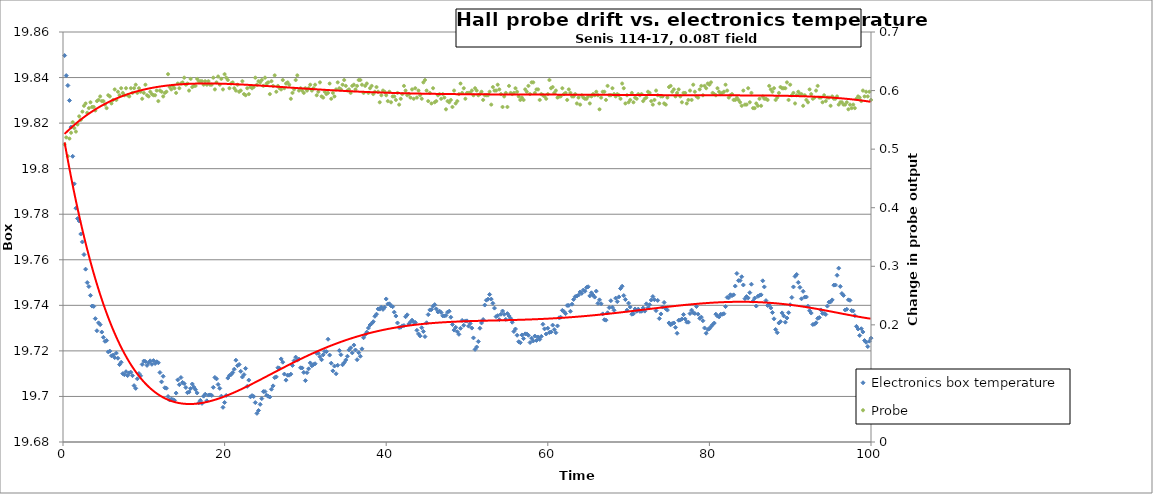
| Category | Electronics box temperature |
|---|---|
| 0.2 | 19.85 |
| 0.4 | 19.841 |
| 0.6000000000000001 | 19.837 |
| 0.8 | 19.83 |
| 1.0 | 19.818 |
| 1.2 | 19.805 |
| 1.4 | 19.793 |
| 1.5999999999999999 | 19.783 |
| 1.7999999999999998 | 19.778 |
| 1.9999999999999998 | 19.777 |
| 2.1999999999999997 | 19.771 |
| 2.4 | 19.768 |
| 2.6 | 19.762 |
| 2.8000000000000003 | 19.756 |
| 3.0000000000000004 | 19.75 |
| 3.2000000000000006 | 19.748 |
| 3.400000000000001 | 19.744 |
| 3.600000000000001 | 19.74 |
| 3.800000000000001 | 19.74 |
| 4.000000000000001 | 19.734 |
| 4.200000000000001 | 19.729 |
| 4.400000000000001 | 19.732 |
| 4.600000000000001 | 19.732 |
| 4.800000000000002 | 19.728 |
| 5.000000000000002 | 19.726 |
| 5.200000000000002 | 19.724 |
| 5.400000000000002 | 19.725 |
| 5.600000000000002 | 19.72 |
| 5.8000000000000025 | 19.72 |
| 6.000000000000003 | 19.718 |
| 6.200000000000003 | 19.718 |
| 6.400000000000003 | 19.717 |
| 6.600000000000003 | 19.719 |
| 6.800000000000003 | 19.717 |
| 7.0000000000000036 | 19.714 |
| 7.200000000000004 | 19.715 |
| 7.400000000000004 | 19.71 |
| 7.600000000000004 | 19.71 |
| 7.800000000000004 | 19.711 |
| 8.000000000000004 | 19.709 |
| 8.200000000000003 | 19.71 |
| 8.400000000000002 | 19.711 |
| 8.600000000000001 | 19.709 |
| 8.8 | 19.705 |
| 9.0 | 19.704 |
| 9.2 | 19.708 |
| 9.399999999999999 | 19.71 |
| 9.599999999999998 | 19.709 |
| 9.799999999999997 | 19.714 |
| 9.999999999999996 | 19.716 |
| 10.199999999999996 | 19.715 |
| 10.399999999999995 | 19.714 |
| 10.599999999999994 | 19.715 |
| 10.799999999999994 | 19.716 |
| 10.999999999999993 | 19.714 |
| 11.199999999999992 | 19.716 |
| 11.399999999999991 | 19.714 |
| 11.59999999999999 | 19.715 |
| 11.79999999999999 | 19.715 |
| 11.99999999999999 | 19.71 |
| 12.199999999999989 | 19.706 |
| 12.399999999999988 | 19.709 |
| 12.599999999999987 | 19.704 |
| 12.799999999999986 | 19.704 |
| 12.999999999999986 | 19.7 |
| 13.199999999999985 | 19.698 |
| 13.399999999999984 | 19.699 |
| 13.599999999999984 | 19.699 |
| 13.799999999999983 | 19.698 |
| 13.999999999999982 | 19.701 |
| 14.199999999999982 | 19.707 |
| 14.39999999999998 | 19.705 |
| 14.59999999999998 | 19.708 |
| 14.79999999999998 | 19.706 |
| 14.999999999999979 | 19.706 |
| 15.199999999999978 | 19.704 |
| 15.399999999999977 | 19.702 |
| 15.599999999999977 | 19.702 |
| 15.799999999999976 | 19.703 |
| 15.999999999999975 | 19.705 |
| 16.199999999999974 | 19.704 |
| 16.399999999999974 | 19.703 |
| 16.599999999999973 | 19.702 |
| 16.799999999999972 | 19.697 |
| 16.99999999999997 | 19.698 |
| 17.19999999999997 | 19.697 |
| 17.39999999999997 | 19.7 |
| 17.59999999999997 | 19.701 |
| 17.79999999999997 | 19.698 |
| 17.999999999999968 | 19.701 |
| 18.199999999999967 | 19.701 |
| 18.399999999999967 | 19.7 |
| 18.599999999999966 | 19.704 |
| 18.799999999999965 | 19.708 |
| 18.999999999999964 | 19.708 |
| 19.199999999999964 | 19.705 |
| 19.399999999999963 | 19.704 |
| 19.599999999999962 | 19.7 |
| 19.79999999999996 | 19.695 |
| 19.99999999999996 | 19.697 |
| 20.19999999999996 | 19.7 |
| 20.39999999999996 | 19.708 |
| 20.59999999999996 | 19.709 |
| 20.799999999999958 | 19.71 |
| 20.999999999999957 | 19.71 |
| 21.199999999999957 | 19.712 |
| 21.399999999999956 | 19.716 |
| 21.599999999999955 | 19.714 |
| 21.799999999999955 | 19.714 |
| 21.999999999999954 | 19.711 |
| 22.199999999999953 | 19.709 |
| 22.399999999999952 | 19.71 |
| 22.59999999999995 | 19.712 |
| 22.79999999999995 | 19.704 |
| 22.99999999999995 | 19.707 |
| 23.19999999999995 | 19.7 |
| 23.39999999999995 | 19.7 |
| 23.599999999999948 | 19.7 |
| 23.799999999999947 | 19.697 |
| 23.999999999999947 | 19.693 |
| 24.199999999999946 | 19.694 |
| 24.399999999999945 | 19.697 |
| 24.599999999999945 | 19.699 |
| 24.799999999999944 | 19.702 |
| 24.999999999999943 | 19.702 |
| 25.199999999999942 | 19.701 |
| 25.39999999999994 | 19.7 |
| 25.59999999999994 | 19.7 |
| 25.79999999999994 | 19.703 |
| 25.99999999999994 | 19.705 |
| 26.19999999999994 | 19.708 |
| 26.399999999999938 | 19.709 |
| 26.599999999999937 | 19.713 |
| 26.799999999999937 | 19.712 |
| 26.999999999999936 | 19.716 |
| 27.199999999999935 | 19.715 |
| 27.399999999999935 | 19.71 |
| 27.599999999999934 | 19.707 |
| 27.799999999999933 | 19.709 |
| 27.999999999999932 | 19.709 |
| 28.199999999999932 | 19.71 |
| 28.39999999999993 | 19.714 |
| 28.59999999999993 | 19.716 |
| 28.79999999999993 | 19.717 |
| 28.99999999999993 | 19.716 |
| 29.19999999999993 | 19.716 |
| 29.399999999999928 | 19.713 |
| 29.599999999999927 | 19.713 |
| 29.799999999999926 | 19.711 |
| 29.999999999999925 | 19.707 |
| 30.199999999999925 | 19.71 |
| 30.399999999999924 | 19.712 |
| 30.599999999999923 | 19.715 |
| 30.799999999999923 | 19.713 |
| 30.999999999999922 | 19.714 |
| 31.19999999999992 | 19.714 |
| 31.39999999999992 | 19.719 |
| 31.59999999999992 | 19.719 |
| 31.79999999999992 | 19.717 |
| 31.99999999999992 | 19.716 |
| 32.19999999999992 | 19.718 |
| 32.39999999999992 | 19.72 |
| 32.59999999999992 | 19.72 |
| 32.799999999999926 | 19.725 |
| 32.99999999999993 | 19.718 |
| 33.19999999999993 | 19.715 |
| 33.399999999999935 | 19.711 |
| 33.59999999999994 | 19.713 |
| 33.79999999999994 | 19.71 |
| 33.99999999999994 | 19.714 |
| 34.199999999999946 | 19.72 |
| 34.39999999999995 | 19.718 |
| 34.59999999999995 | 19.714 |
| 34.799999999999955 | 19.715 |
| 34.99999999999996 | 19.716 |
| 35.19999999999996 | 19.718 |
| 35.39999999999996 | 19.72 |
| 35.599999999999966 | 19.721 |
| 35.79999999999997 | 19.719 |
| 35.99999999999997 | 19.723 |
| 36.199999999999974 | 19.72 |
| 36.39999999999998 | 19.716 |
| 36.59999999999998 | 19.719 |
| 36.79999999999998 | 19.718 |
| 36.999999999999986 | 19.721 |
| 37.19999999999999 | 19.726 |
| 37.39999999999999 | 19.727 |
| 37.599999999999994 | 19.728 |
| 37.8 | 19.73 |
| 38.0 | 19.731 |
| 38.2 | 19.732 |
| 38.400000000000006 | 19.733 |
| 38.60000000000001 | 19.735 |
| 38.80000000000001 | 19.736 |
| 39.000000000000014 | 19.738 |
| 39.20000000000002 | 19.738 |
| 39.40000000000002 | 19.739 |
| 39.60000000000002 | 19.738 |
| 39.800000000000026 | 19.739 |
| 40.00000000000003 | 19.743 |
| 40.20000000000003 | 19.741 |
| 40.400000000000034 | 19.741 |
| 40.60000000000004 | 19.74 |
| 40.80000000000004 | 19.739 |
| 41.00000000000004 | 19.737 |
| 41.200000000000045 | 19.735 |
| 41.40000000000005 | 19.732 |
| 41.60000000000005 | 19.73 |
| 41.800000000000054 | 19.73 |
| 42.00000000000006 | 19.731 |
| 42.20000000000006 | 19.731 |
| 42.40000000000006 | 19.735 |
| 42.600000000000065 | 19.736 |
| 42.80000000000007 | 19.732 |
| 43.00000000000007 | 19.733 |
| 43.200000000000074 | 19.733 |
| 43.40000000000008 | 19.733 |
| 43.60000000000008 | 19.732 |
| 43.80000000000008 | 19.729 |
| 44.000000000000085 | 19.727 |
| 44.20000000000009 | 19.727 |
| 44.40000000000009 | 19.73 |
| 44.600000000000094 | 19.729 |
| 44.8000000000001 | 19.726 |
| 45.0000000000001 | 19.732 |
| 45.2000000000001 | 19.736 |
| 45.400000000000105 | 19.738 |
| 45.60000000000011 | 19.738 |
| 45.80000000000011 | 19.74 |
| 46.000000000000114 | 19.74 |
| 46.20000000000012 | 19.738 |
| 46.40000000000012 | 19.737 |
| 46.60000000000012 | 19.737 |
| 46.800000000000125 | 19.737 |
| 47.00000000000013 | 19.735 |
| 47.20000000000013 | 19.735 |
| 47.400000000000134 | 19.736 |
| 47.600000000000136 | 19.737 |
| 47.80000000000014 | 19.737 |
| 48.00000000000014 | 19.735 |
| 48.200000000000145 | 19.732 |
| 48.40000000000015 | 19.729 |
| 48.60000000000015 | 19.73 |
| 48.80000000000015 | 19.728 |
| 49.000000000000156 | 19.727 |
| 49.20000000000016 | 19.73 |
| 49.40000000000016 | 19.733 |
| 49.600000000000165 | 19.731 |
| 49.80000000000017 | 19.733 |
| 50.00000000000017 | 19.733 |
| 50.20000000000017 | 19.731 |
| 50.400000000000176 | 19.732 |
| 50.60000000000018 | 19.73 |
| 50.80000000000018 | 19.726 |
| 51.000000000000185 | 19.721 |
| 51.20000000000019 | 19.722 |
| 51.40000000000019 | 19.724 |
| 51.60000000000019 | 19.73 |
| 51.800000000000196 | 19.732 |
| 52.0000000000002 | 19.734 |
| 52.2000000000002 | 19.74 |
| 52.400000000000205 | 19.742 |
| 52.60000000000021 | 19.743 |
| 52.80000000000021 | 19.745 |
| 53.00000000000021 | 19.743 |
| 53.200000000000216 | 19.741 |
| 53.40000000000022 | 19.739 |
| 53.60000000000022 | 19.735 |
| 53.800000000000225 | 19.735 |
| 54.00000000000023 | 19.734 |
| 54.20000000000023 | 19.736 |
| 54.40000000000023 | 19.738 |
| 54.600000000000236 | 19.736 |
| 54.80000000000024 | 19.734 |
| 55.00000000000024 | 19.736 |
| 55.200000000000244 | 19.735 |
| 55.40000000000025 | 19.734 |
| 55.60000000000025 | 19.733 |
| 55.80000000000025 | 19.729 |
| 56.000000000000256 | 19.73 |
| 56.20000000000026 | 19.727 |
| 56.40000000000026 | 19.724 |
| 56.600000000000264 | 19.724 |
| 56.80000000000027 | 19.727 |
| 57.00000000000027 | 19.725 |
| 57.20000000000027 | 19.727 |
| 57.400000000000276 | 19.727 |
| 57.60000000000028 | 19.727 |
| 57.80000000000028 | 19.724 |
| 58.000000000000284 | 19.726 |
| 58.20000000000029 | 19.724 |
| 58.40000000000029 | 19.727 |
| 58.60000000000029 | 19.725 |
| 58.800000000000296 | 19.726 |
| 59.0000000000003 | 19.725 |
| 59.2000000000003 | 19.726 |
| 59.400000000000304 | 19.732 |
| 59.60000000000031 | 19.73 |
| 59.80000000000031 | 19.727 |
| 60.00000000000031 | 19.73 |
| 60.200000000000315 | 19.728 |
| 60.40000000000032 | 19.728 |
| 60.60000000000032 | 19.731 |
| 60.800000000000324 | 19.729 |
| 61.00000000000033 | 19.728 |
| 61.20000000000033 | 19.731 |
| 61.40000000000033 | 19.735 |
| 61.600000000000335 | 19.735 |
| 61.80000000000034 | 19.738 |
| 62.00000000000034 | 19.737 |
| 62.200000000000344 | 19.736 |
| 62.40000000000035 | 19.74 |
| 62.60000000000035 | 19.74 |
| 62.80000000000035 | 19.737 |
| 63.000000000000355 | 19.74 |
| 63.20000000000036 | 19.743 |
| 63.40000000000036 | 19.744 |
| 63.600000000000364 | 19.744 |
| 63.80000000000037 | 19.745 |
| 64.00000000000037 | 19.746 |
| 64.20000000000037 | 19.745 |
| 64.40000000000038 | 19.747 |
| 64.60000000000038 | 19.746 |
| 64.80000000000038 | 19.748 |
| 65.00000000000038 | 19.748 |
| 65.20000000000039 | 19.744 |
| 65.40000000000039 | 19.745 |
| 65.60000000000039 | 19.745 |
| 65.8000000000004 | 19.744 |
| 66.0000000000004 | 19.746 |
| 66.2000000000004 | 19.741 |
| 66.4000000000004 | 19.742 |
| 66.6000000000004 | 19.741 |
| 66.80000000000041 | 19.736 |
| 67.00000000000041 | 19.734 |
| 67.20000000000041 | 19.733 |
| 67.40000000000042 | 19.737 |
| 67.60000000000042 | 19.739 |
| 67.80000000000042 | 19.742 |
| 68.00000000000043 | 19.739 |
| 68.20000000000043 | 19.738 |
| 68.40000000000043 | 19.743 |
| 68.60000000000043 | 19.742 |
| 68.80000000000044 | 19.744 |
| 69.00000000000044 | 19.747 |
| 69.20000000000044 | 19.748 |
| 69.40000000000045 | 19.744 |
| 69.60000000000045 | 19.743 |
| 69.80000000000045 | 19.738 |
| 70.00000000000045 | 19.741 |
| 70.20000000000046 | 19.739 |
| 70.40000000000046 | 19.736 |
| 70.60000000000046 | 19.736 |
| 70.80000000000047 | 19.738 |
| 71.00000000000047 | 19.737 |
| 71.20000000000047 | 19.738 |
| 71.40000000000047 | 19.737 |
| 71.60000000000048 | 19.737 |
| 71.80000000000048 | 19.739 |
| 72.00000000000048 | 19.737 |
| 72.20000000000049 | 19.741 |
| 72.40000000000049 | 19.739 |
| 72.60000000000049 | 19.74 |
| 72.8000000000005 | 19.742 |
| 73.0000000000005 | 19.744 |
| 73.2000000000005 | 19.742 |
| 73.4000000000005 | 19.738 |
| 73.6000000000005 | 19.742 |
| 73.80000000000051 | 19.734 |
| 74.00000000000051 | 19.736 |
| 74.20000000000051 | 19.739 |
| 74.40000000000052 | 19.741 |
| 74.60000000000052 | 19.738 |
| 74.80000000000052 | 19.738 |
| 75.00000000000053 | 19.732 |
| 75.20000000000053 | 19.731 |
| 75.40000000000053 | 19.732 |
| 75.60000000000053 | 19.732 |
| 75.80000000000054 | 19.73 |
| 76.00000000000054 | 19.728 |
| 76.20000000000054 | 19.733 |
| 76.40000000000055 | 19.734 |
| 76.60000000000055 | 19.734 |
| 76.80000000000055 | 19.736 |
| 77.00000000000055 | 19.734 |
| 77.20000000000056 | 19.733 |
| 77.40000000000056 | 19.733 |
| 77.60000000000056 | 19.736 |
| 77.80000000000057 | 19.738 |
| 78.00000000000057 | 19.737 |
| 78.20000000000057 | 19.736 |
| 78.40000000000057 | 19.739 |
| 78.60000000000058 | 19.736 |
| 78.80000000000058 | 19.734 |
| 79.00000000000058 | 19.735 |
| 79.20000000000059 | 19.733 |
| 79.40000000000059 | 19.73 |
| 79.60000000000059 | 19.728 |
| 79.8000000000006 | 19.729 |
| 80.0000000000006 | 19.73 |
| 80.2000000000006 | 19.731 |
| 80.4000000000006 | 19.732 |
| 80.6000000000006 | 19.732 |
| 80.80000000000061 | 19.736 |
| 81.00000000000061 | 19.735 |
| 81.20000000000061 | 19.735 |
| 81.40000000000062 | 19.736 |
| 81.60000000000062 | 19.736 |
| 81.80000000000062 | 19.736 |
| 82.00000000000063 | 19.739 |
| 82.20000000000063 | 19.743 |
| 82.40000000000063 | 19.743 |
| 82.60000000000063 | 19.745 |
| 82.80000000000064 | 19.744 |
| 83.00000000000064 | 19.745 |
| 83.20000000000064 | 19.748 |
| 83.40000000000065 | 19.754 |
| 83.60000000000065 | 19.751 |
| 83.80000000000065 | 19.751 |
| 84.00000000000065 | 19.753 |
| 84.20000000000066 | 19.749 |
| 84.40000000000066 | 19.743 |
| 84.60000000000066 | 19.744 |
| 84.80000000000067 | 19.743 |
| 85.00000000000067 | 19.746 |
| 85.20000000000067 | 19.749 |
| 85.40000000000067 | 19.742 |
| 85.60000000000068 | 19.743 |
| 85.80000000000068 | 19.74 |
| 86.00000000000068 | 19.744 |
| 86.20000000000068 | 19.744 |
| 86.40000000000069 | 19.745 |
| 86.60000000000069 | 19.751 |
| 86.8000000000007 | 19.748 |
| 87.0000000000007 | 19.742 |
| 87.2000000000007 | 19.74 |
| 87.4000000000007 | 19.74 |
| 87.6000000000007 | 19.739 |
| 87.80000000000071 | 19.737 |
| 88.00000000000071 | 19.734 |
| 88.20000000000071 | 19.729 |
| 88.40000000000072 | 19.728 |
| 88.60000000000072 | 19.732 |
| 88.80000000000072 | 19.733 |
| 89.00000000000072 | 19.737 |
| 89.20000000000073 | 19.735 |
| 89.40000000000073 | 19.733 |
| 89.60000000000073 | 19.734 |
| 89.80000000000074 | 19.737 |
| 90.00000000000074 | 19.74 |
| 90.20000000000074 | 19.743 |
| 90.40000000000074 | 19.748 |
| 90.60000000000075 | 19.753 |
| 90.80000000000075 | 19.754 |
| 91.00000000000075 | 19.75 |
| 91.20000000000076 | 19.748 |
| 91.40000000000076 | 19.743 |
| 91.60000000000076 | 19.746 |
| 91.80000000000076 | 19.744 |
| 92.00000000000077 | 19.744 |
| 92.20000000000077 | 19.74 |
| 92.40000000000077 | 19.738 |
| 92.60000000000078 | 19.737 |
| 92.80000000000078 | 19.732 |
| 93.00000000000078 | 19.732 |
| 93.20000000000078 | 19.732 |
| 93.40000000000079 | 19.734 |
| 93.60000000000079 | 19.735 |
| 93.8000000000008 | 19.738 |
| 94.0000000000008 | 19.736 |
| 94.2000000000008 | 19.736 |
| 94.4000000000008 | 19.736 |
| 94.6000000000008 | 19.74 |
| 94.80000000000081 | 19.741 |
| 95.00000000000081 | 19.742 |
| 95.20000000000081 | 19.742 |
| 95.40000000000082 | 19.749 |
| 95.60000000000082 | 19.749 |
| 95.80000000000082 | 19.753 |
| 96.00000000000082 | 19.756 |
| 96.20000000000083 | 19.748 |
| 96.40000000000083 | 19.745 |
| 96.60000000000083 | 19.744 |
| 96.80000000000084 | 19.738 |
| 97.00000000000084 | 19.738 |
| 97.20000000000084 | 19.742 |
| 97.40000000000084 | 19.742 |
| 97.60000000000085 | 19.738 |
| 97.80000000000085 | 19.738 |
| 98.00000000000085 | 19.735 |
| 98.20000000000086 | 19.731 |
| 98.40000000000086 | 19.73 |
| 98.60000000000086 | 19.727 |
| 98.80000000000086 | 19.73 |
| 99.00000000000087 | 19.728 |
| 99.20000000000087 | 19.725 |
| 99.40000000000087 | 19.724 |
| 99.60000000000088 | 19.722 |
| 99.80000000000088 | 19.724 |
| 100.00000000000088 | 19.726 |
| nan | 19.721 |
| nan | 19.719 |
| nan | 19.716 |
| nan | 19.714 |
| nan | 19.712 |
| nan | 19.712 |
| nan | 19.72 |
| nan | 19.718 |
| nan | 19.721 |
| nan | 19.723 |
| nan | 19.721 |
| nan | 19.721 |
| nan | 19.725 |
| nan | 19.725 |
| nan | 19.729 |
| nan | 19.728 |
| nan | 19.729 |
| nan | 19.73 |
| nan | 19.728 |
| nan | 19.73 |
| nan | 19.729 |
| nan | 19.729 |
| nan | 19.728 |
| nan | 19.726 |
| nan | 19.722 |
| nan | 19.723 |
| nan | 19.723 |
| nan | 19.72 |
| nan | 19.721 |
| nan | 19.721 |
| nan | 19.722 |
| nan | 19.723 |
| nan | 19.722 |
| nan | 19.719 |
| nan | 19.721 |
| nan | 19.724 |
| nan | 19.724 |
| nan | 19.727 |
| nan | 19.733 |
| nan | 19.735 |
| nan | 19.735 |
| nan | 19.735 |
| nan | 19.734 |
| nan | 19.733 |
| nan | 19.729 |
| nan | 19.728 |
| nan | 19.729 |
| nan | 19.729 |
| nan | 19.729 |
| nan | 19.731 |
| nan | 19.73 |
| nan | 19.729 |
| nan | 19.729 |
| nan | 19.729 |
| nan | 19.729 |
| nan | 19.728 |
| nan | 19.723 |
| nan | 19.725 |
| nan | 19.724 |
| nan | 19.727 |
| nan | 19.724 |
| nan | 19.726 |
| nan | 19.726 |
| nan | 19.727 |
| nan | 19.732 |
| nan | 19.732 |
| nan | 19.733 |
| nan | 19.732 |
| nan | 19.73 |
| nan | 19.731 |
| nan | 19.732 |
| nan | 19.732 |
| nan | 19.731 |
| nan | 19.731 |
| nan | 19.732 |
| nan | 19.732 |
| nan | 19.729 |
| nan | 19.726 |
| nan | 19.721 |
| nan | 19.722 |
| nan | 19.722 |
| nan | 19.724 |
| nan | 19.725 |
| nan | 19.728 |
| nan | 19.725 |
| nan | 19.728 |
| nan | 19.734 |
| nan | 19.738 |
| nan | 19.732 |
| nan | 19.733 |
| nan | 19.731 |
| nan | 19.737 |
| nan | 19.734 |
| nan | 19.736 |
| nan | 19.735 |
| nan | 19.736 |
| nan | 19.738 |
| nan | 19.735 |
| nan | 19.738 |
| nan | 19.739 |
| nan | 19.741 |
| nan | 19.742 |
| nan | 19.74 |
| nan | 19.742 |
| nan | 19.74 |
| nan | 19.738 |
| nan | 19.739 |
| nan | 19.74 |
| nan | 19.74 |
| nan | 19.741 |
| nan | 19.739 |
| nan | 19.744 |
| nan | 19.746 |
| nan | 19.747 |
| nan | 19.749 |
| nan | 19.751 |
| nan | 19.75 |
| nan | 19.748 |
| nan | 19.748 |
| nan | 19.747 |
| nan | 19.746 |
| nan | 19.746 |
| nan | 19.745 |
| nan | 19.744 |
| nan | 19.742 |
| nan | 19.745 |
| nan | 19.745 |
| nan | 19.746 |
| nan | 19.746 |
| nan | 19.747 |
| nan | 19.748 |
| nan | 19.749 |
| nan | 19.746 |
| nan | 19.746 |
| nan | 19.743 |
| nan | 19.742 |
| nan | 19.739 |
| nan | 19.739 |
| nan | 19.736 |
| nan | 19.736 |
| nan | 19.732 |
| nan | 19.729 |
| nan | 19.725 |
| nan | 19.724 |
| nan | 19.724 |
| nan | 19.724 |
| nan | 19.723 |
| nan | 19.728 |
| nan | 19.726 |
| nan | 19.724 |
| nan | 19.722 |
| nan | 19.719 |
| nan | 19.721 |
| nan | 19.722 |
| nan | 19.724 |
| nan | 19.724 |
| nan | 19.722 |
| nan | 19.724 |
| nan | 19.727 |
| nan | 19.727 |
| nan | 19.728 |
| nan | 19.722 |
| nan | 19.726 |
| nan | 19.729 |
| nan | 19.729 |
| nan | 19.731 |
| nan | 19.735 |
| nan | 19.738 |
| nan | 19.74 |
| nan | 19.74 |
| nan | 19.743 |
| nan | 19.743 |
| nan | 19.74 |
| nan | 19.738 |
| nan | 19.738 |
| nan | 19.738 |
| nan | 19.735 |
| nan | 19.736 |
| nan | 19.734 |
| nan | 19.735 |
| nan | 19.731 |
| nan | 19.73 |
| nan | 19.726 |
| nan | 19.727 |
| nan | 19.728 |
| nan | 19.725 |
| nan | 19.724 |
| nan | 19.726 |
| nan | 19.728 |
| nan | 19.728 |
| nan | 19.726 |
| nan | 19.722 |
| nan | 19.72 |
| nan | 19.722 |
| nan | 19.72 |
| nan | 19.723 |
| nan | 19.721 |
| nan | 19.723 |
| nan | 19.724 |
| nan | 19.723 |
| nan | 19.722 |
| nan | 19.719 |
| nan | 19.718 |
| nan | 19.717 |
| nan | 19.717 |
| nan | 19.72 |
| nan | 19.722 |
| nan | 19.726 |
| nan | 19.726 |
| nan | 19.726 |
| nan | 19.726 |
| nan | 19.725 |
| nan | 19.723 |
| nan | 19.728 |
| nan | 19.725 |
| nan | 19.728 |
| nan | 19.729 |
| nan | 19.73 |
| nan | 19.736 |
| nan | 19.735 |
| nan | 19.738 |
| nan | 19.742 |
| nan | 19.74 |
| nan | 19.746 |
| nan | 19.749 |
| nan | 19.747 |
| nan | 19.745 |
| nan | 19.744 |
| nan | 19.745 |
| nan | 19.744 |
| nan | 19.739 |
| nan | 19.738 |
| nan | 19.741 |
| nan | 19.738 |
| nan | 19.739 |
| nan | 19.739 |
| nan | 19.738 |
| nan | 19.739 |
| nan | 19.74 |
| nan | 19.74 |
| nan | 19.74 |
| nan | 19.741 |
| nan | 19.742 |
| nan | 19.74 |
| nan | 19.744 |
| nan | 19.742 |
| nan | 19.744 |
| nan | 19.742 |
| nan | 19.745 |
| nan | 19.744 |
| nan | 19.743 |
| nan | 19.743 |
| nan | 19.742 |
| nan | 19.738 |
| nan | 19.74 |
| nan | 19.738 |
| nan | 19.742 |
| nan | 19.74 |
| nan | 19.735 |
| nan | 19.735 |
| nan | 19.736 |
| nan | 19.727 |
| nan | 19.725 |
| nan | 19.723 |
| nan | 19.725 |
| nan | 19.725 |
| nan | 19.721 |
| nan | 19.723 |
| nan | 19.727 |
| nan | 19.73 |
| nan | 19.733 |
| nan | 19.734 |
| nan | 19.736 |
| nan | 19.741 |
| nan | 19.747 |
| nan | 19.748 |
| nan | 19.747 |
| nan | 19.746 |
| nan | 19.741 |
| nan | 19.737 |
| nan | 19.732 |
| nan | 19.735 |
| nan | 19.731 |
| nan | 19.729 |
| nan | 19.725 |
| nan | 19.725 |
| nan | 19.728 |
| nan | 19.73 |
| nan | 19.728 |
| nan | 19.73 |
| nan | 19.73 |
| nan | 19.731 |
| nan | 19.733 |
| nan | 19.734 |
| nan | 19.735 |
| nan | 19.734 |
| nan | 19.74 |
| nan | 19.742 |
| nan | 19.741 |
| nan | 19.739 |
| nan | 19.742 |
| nan | 19.743 |
| nan | 19.743 |
| nan | 19.745 |
| nan | 19.74 |
| nan | 19.737 |
| nan | 19.735 |
| nan | 19.734 |
| nan | 19.731 |
| nan | 19.735 |
| nan | 19.737 |
| nan | 19.734 |
| nan | 19.733 |
| nan | 19.732 |
| nan | 19.733 |
| nan | 19.735 |
| nan | 19.73 |
| nan | 19.728 |
| nan | 19.729 |
| nan | 19.73 |
| nan | 19.729 |
| nan | 19.733 |
| nan | 19.741 |
| nan | 19.743 |
| nan | 19.75 |
| nan | 19.752 |
| nan | 19.757 |
| nan | 19.754 |
| nan | 19.754 |
| nan | 19.755 |
| nan | 19.751 |
| nan | 19.753 |
| nan | 19.757 |
| nan | 19.756 |
| nan | 19.758 |
| nan | 19.762 |
| nan | 19.761 |
| nan | 19.762 |
| nan | 19.757 |
| nan | 19.755 |
| nan | 19.755 |
| nan | 19.754 |
| nan | 19.755 |
| nan | 19.756 |
| nan | 19.754 |
| nan | 19.757 |
| nan | 19.76 |
| nan | 19.764 |
| nan | 19.764 |
| nan | 19.764 |
| nan | 19.765 |
| nan | 19.767 |
| nan | 19.767 |
| nan | 19.763 |
| nan | 19.761 |
| nan | 19.766 |
| nan | 19.762 |
| nan | 19.758 |
| nan | 19.761 |
| nan | 19.758 |
| nan | 19.757 |
| nan | 19.751 |
| nan | 19.749 |
| nan | 19.747 |
| nan | 19.745 |
| nan | 19.747 |
| nan | 19.742 |
| nan | 19.741 |
| nan | 19.74 |
| nan | 19.741 |
| nan | 19.747 |
| nan | 19.747 |
| nan | 19.747 |
| nan | 19.749 |
| nan | 19.749 |
| nan | 19.75 |
| nan | 19.748 |
| nan | 19.749 |
| nan | 19.751 |
| nan | 19.752 |
| nan | 19.755 |
| nan | 19.757 |
| nan | 19.757 |
| nan | 19.751 |
| nan | 19.754 |
| nan | 19.761 |
| nan | 19.764 |
| nan | 19.766 |
| nan | 19.758 |
| nan | 19.761 |
| nan | 19.762 |
| nan | 19.759 |
| nan | 19.76 |
| nan | 19.759 |
| nan | 19.763 |
| nan | 19.76 |
| nan | 19.755 |
| nan | 19.76 |
| nan | 19.761 |
| nan | 19.76 |
| nan | 19.758 |
| nan | 19.759 |
| nan | 19.76 |
| nan | 19.755 |
| nan | 19.756 |
| nan | 19.757 |
| nan | 19.757 |
| nan | 19.753 |
| nan | 19.758 |
| nan | 19.758 |
| nan | 19.757 |
| nan | 19.753 |
| nan | 19.753 |
| nan | 19.751 |
| nan | 19.747 |
| nan | 19.75 |
| nan | 19.75 |
| nan | 19.746 |
| nan | 19.748 |
| nan | 19.746 |
| nan | 19.744 |
| nan | 19.736 |
| nan | 19.736 |
| nan | 19.742 |
| nan | 19.744 |
| nan | 19.741 |
| nan | 19.747 |
| nan | 19.743 |
| nan | 19.745 |
| nan | 19.744 |
| nan | 19.745 |
| nan | 19.74 |
| nan | 19.741 |
| nan | 19.745 |
| nan | 19.75 |
| nan | 19.75 |
| nan | 19.751 |
| nan | 19.75 |
| nan | 19.746 |
| nan | 19.748 |
| nan | 19.749 |
| nan | 19.749 |
| nan | 19.744 |
| nan | 19.743 |
| nan | 19.744 |
| nan | 19.749 |
| nan | 19.754 |
| nan | 19.76 |
| nan | 19.758 |
| nan | 19.755 |
| nan | 19.752 |
| nan | 19.753 |
| nan | 19.753 |
| nan | 19.754 |
| nan | 19.748 |
| nan | 19.745 |
| nan | 19.745 |
| nan | 19.746 |
| nan | 19.748 |
| nan | 19.748 |
| nan | 19.747 |
| nan | 19.745 |
| nan | 19.746 |
| nan | 19.748 |
| nan | 19.748 |
| nan | 19.744 |
| nan | 19.745 |
| nan | 19.746 |
| nan | 19.739 |
| nan | 19.743 |
| nan | 19.745 |
| nan | 19.747 |
| nan | 19.746 |
| nan | 19.754 |
| nan | 19.759 |
| nan | 19.759 |
| nan | 19.756 |
| nan | 19.757 |
| nan | 19.759 |
| nan | 19.757 |
| nan | 19.755 |
| nan | 19.755 |
| nan | 19.759 |
| nan | 19.76 |
| nan | 19.757 |
| nan | 19.754 |
| nan | 19.752 |
| nan | 19.754 |
| nan | 19.754 |
| nan | 19.756 |
| nan | 19.756 |
| nan | 19.756 |
| nan | 19.751 |
| nan | 19.75 |
| nan | 19.748 |
| nan | 19.75 |
| nan | 19.745 |
| nan | 19.738 |
| nan | 19.735 |
| nan | 19.732 |